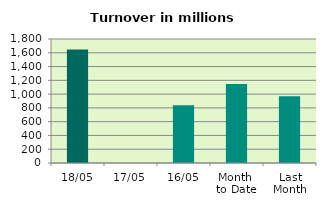
| Category | Series 0 |
|---|---|
| 18/05 | 1648.951 |
| 17/05 | 0 |
| 16/05 | 838.071 |
| Month 
to Date | 1147.517 |
| Last
Month | 968.247 |